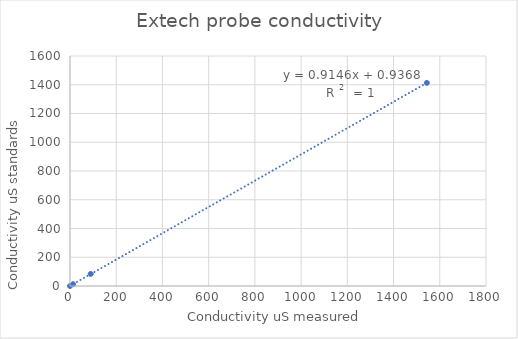
| Category | Series 0 |
|---|---|
| 0.0 | 0 |
| 13.09 | 12.88 |
| 89.7 | 84 |
| 1544.0 | 1413 |